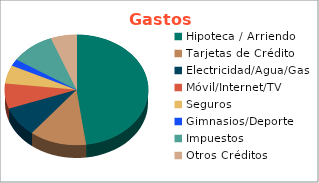
| Category | Series 0 |
|---|---|
| Hipoteca / Arriendo | 14400000 |
| Tarjetas de Crédito | 3852000 |
| Electricidad/Agua/Gas | 2652000 |
| Móvil/Internet/TV | 2220000 |
| Seguros | 1610400 |
| Gimnasios/Deporte | 600000 |
| Impuestos | 3000000 |
| Otros Créditos | 1748000 |